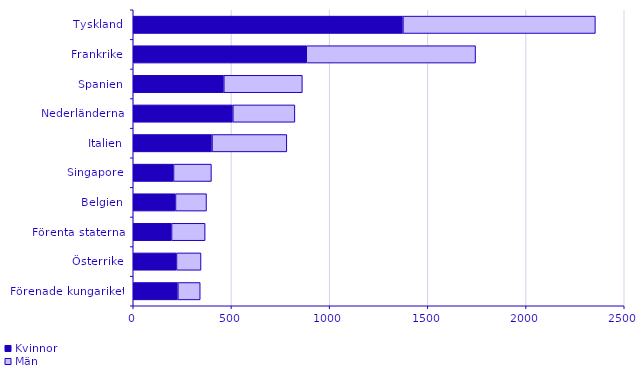
| Category | Kvinnor | Män |
|---|---|---|
| Förenade kungariket | 227 | 114 |
| Österrike | 220 | 125 |
| Förenta staterna | 195 | 171 |
| Belgien | 215 | 158 |
| Singapore | 205 | 193 |
| Italien | 401 | 381 |
| Nederländerna | 507 | 316 |
| Spanien | 461 | 400 |
| Frankrike | 881 | 862 |
| Tyskland | 1373 | 980 |